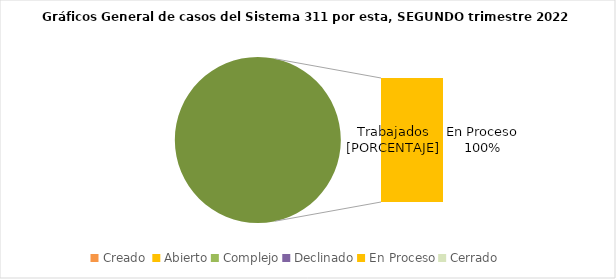
| Category | Series 0 |
|---|---|
| Creado  | 0 |
| Abierto | 0 |
| Complejo | 0 |
| Declinado | 0 |
| En Proceso | 1 |
| Cerrado  | 0 |